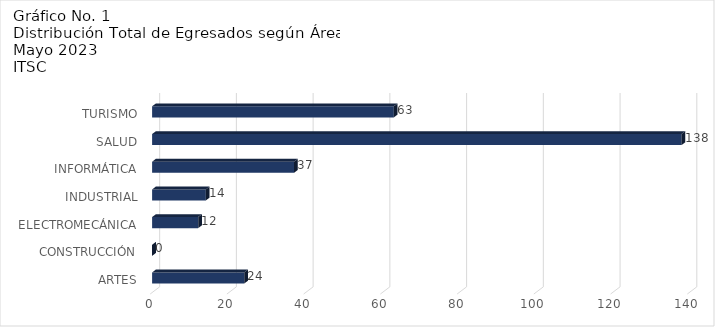
| Category | Series 0 |
|---|---|
| ARTES | 24 |
| CONSTRUCCIÓN | 0 |
| ELECTROMECÁNICA | 12 |
| INDUSTRIAL | 14 |
| INFORMÁTICA | 37 |
| SALUD | 138 |
| TURISMO | 63 |